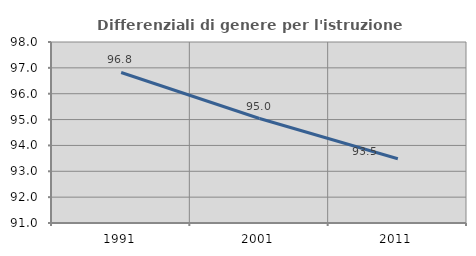
| Category | Differenziali di genere per l'istruzione superiore |
|---|---|
| 1991.0 | 96.822 |
| 2001.0 | 95.04 |
| 2011.0 | 93.487 |